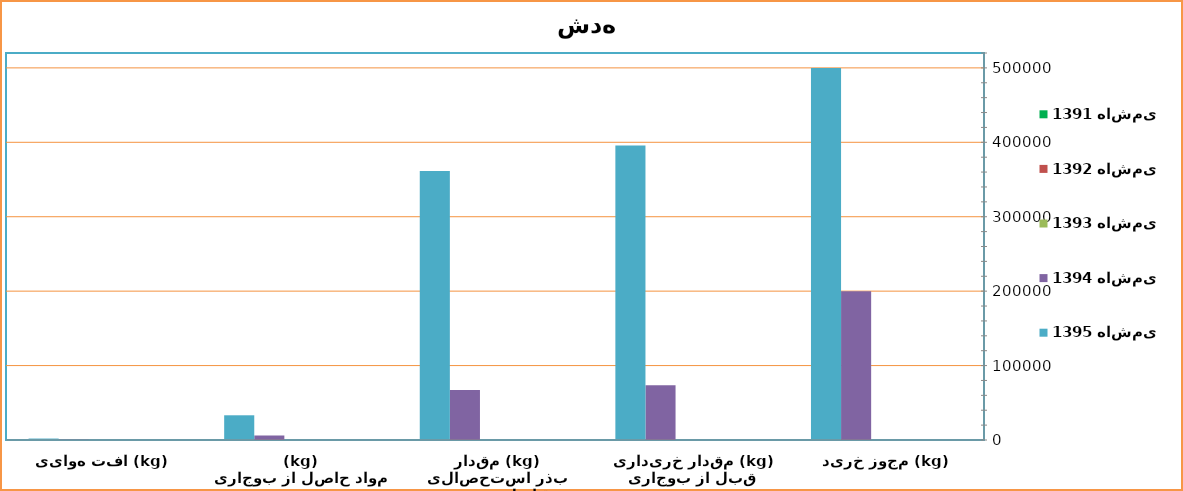
| Category | 1391 هاشمی  | 1392 هاشمی  | 1393 هاشمی  | 1394 هاشمی  | 1395 هاشمی  |
|---|---|---|---|---|---|
| مجوز خرید (kg) | 0 | 0 | 0 | 200000 | 500000 |
| مقدار خریداری قبل از بوجاری (kg) | 0 | 0 | 0 | 73472 | 395662 |
| مقدار بذر استحصالی قابل توزیع (kg) | 0 | 0 | 0 | 67050 | 361500 |
| مواد حاصل از بوجاری (kg) | 0 | 0 | 0 | 6054 | 33210 |
| افت هوایی (kg) | 0 | 0 | 0 | 368 | 1952 |